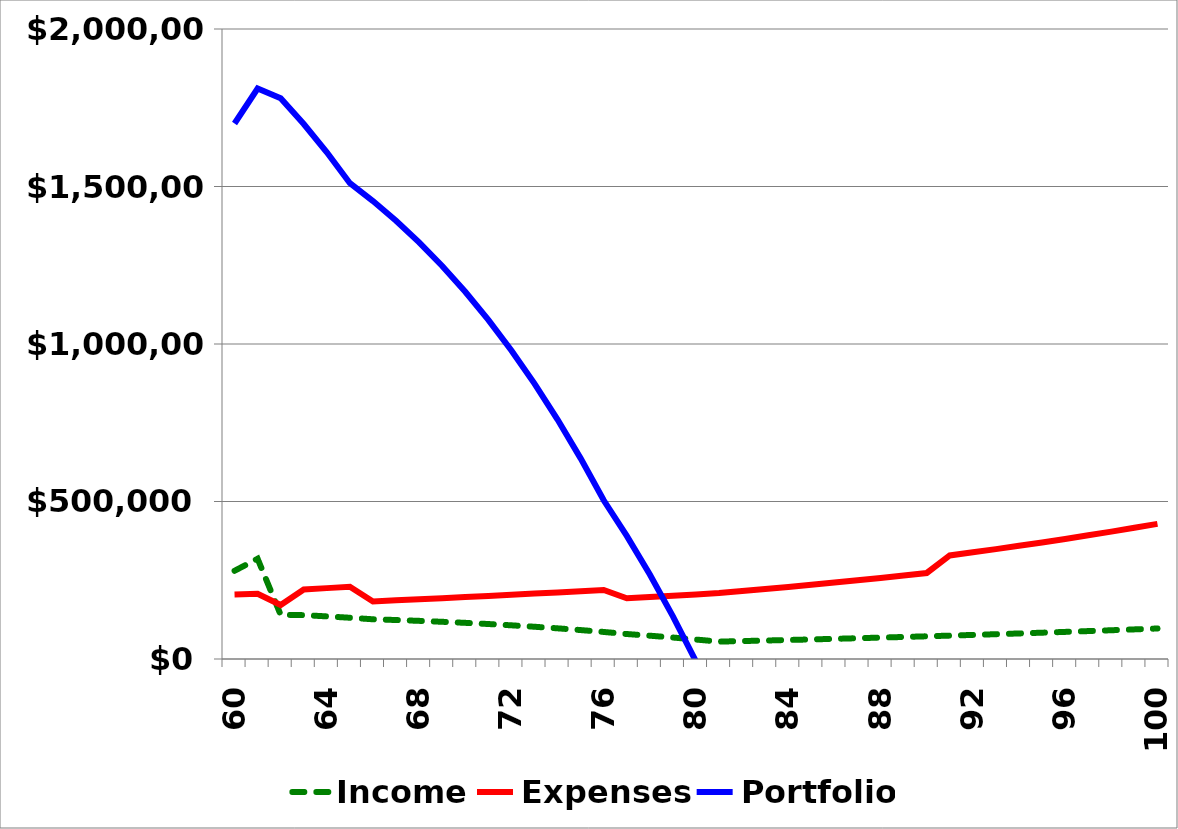
| Category | Income | Expenses | Portfolio |
|---|---|---|---|
| 60.0 | 280000 | 205000 | 1700000 |
| 61.0 | 318300 | 207176 | 1811124 |
| 62.0 | 140167.44 | 171381.337 | 1779910.103 |
| 63.0 | 139239.606 | 220869.048 | 1698280.661 |
| 64.0 | 135315.19 | 224992.767 | 1608603.084 |
| 65.0 | 130937.086 | 229166.287 | 1510373.883 |
| 66.0 | 126075.96 | 182739.746 | 1453710.097 |
| 67.0 | 123739.739 | 186155.869 | 1391293.967 |
| 68.0 | 121090.285 | 189620.983 | 1322763.27 |
| 69.0 | 118106.823 | 193134.055 | 1247736.038 |
| 70.0 | 114767.42 | 196693.903 | 1165809.555 |
| 71.0 | 111048.929 | 200299.187 | 1076559.297 |
| 72.0 | 106926.924 | 203948.398 | 979537.823 |
| 73.0 | 102375.636 | 207639.849 | 874273.61 |
| 74.0 | 97367.885 | 211371.66 | 760269.834 |
| 75.0 | 91875.002 | 215141.748 | 637003.088 |
| 76.0 | 85866.762 | 218947.812 | 503922.038 |
| 77.0 | 79311.296 | 192555.454 | 390677.88 |
| 78.0 | 73988.926 | 196637.742 | 268029.064 |
| 79.0 | 68146.444 | 200763.201 | 135412.307 |
| 80.0 | 61751.38 | 204929.416 | -7765.729 |
| 81.0 | 55235.441 | 209236.233 | -161766.522 |
| 82.0 | 56892.504 | 215513.32 | -320387.338 |
| 83.0 | 58599.279 | 221978.72 | -483766.778 |
| 84.0 | 60357.257 | 228638.081 | -652047.602 |
| 85.0 | 62167.975 | 235497.224 | -825376.851 |
| 86.0 | 64033.014 | 242562.14 | -1003905.977 |
| 87.0 | 65954.005 | 249839.005 | -1187790.977 |
| 88.0 | 67932.625 | 257334.175 | -1377192.526 |
| 89.0 | 69970.604 | 265054.2 | -1572276.123 |
| 90.0 | 72069.722 | 273005.826 | -1773212.227 |
| 91.0 | 74231.813 | 328839.435 | -2027819.849 |
| 92.0 | 76458.768 | 338704.618 | -2290065.699 |
| 93.0 | 78752.531 | 348865.757 | -2560178.925 |
| 94.0 | 81115.107 | 359331.73 | -2838395.548 |
| 95.0 | 83548.56 | 370111.681 | -3124958.669 |
| 96.0 | 86055.017 | 381215.032 | -3420118.684 |
| 97.0 | 88636.667 | 392651.483 | -3724133.5 |
| 98.0 | 91295.767 | 404431.027 | -4037268.76 |
| 99.0 | 94034.64 | 416563.958 | -4359798.077 |
| 100.0 | 96855.68 | 429060.877 | -4692003.275 |